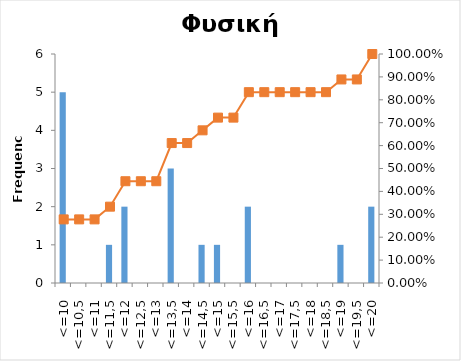
| Category | Series 0 |
|---|---|
| <=10 | 5 |
| <=10,5 | 0 |
| <=11 | 0 |
| <=11,5 | 1 |
| <=12 | 2 |
| <=12,5 | 0 |
| <=13 | 0 |
| <=13,5 | 3 |
| <=14 | 0 |
| <=14,5 | 1 |
| <=15 | 1 |
| <=15,5 | 0 |
| <=16 | 2 |
| <=16,5 | 0 |
| <=17 | 0 |
| <=17,5 | 0 |
| <=18 | 0 |
| <=18,5 | 0 |
| <=19 | 1 |
| <=19,5 | 0 |
| <=20 | 2 |